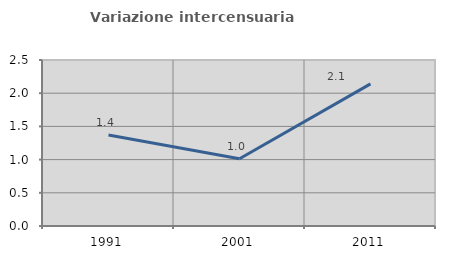
| Category | Variazione intercensuaria annua |
|---|---|
| 1991.0 | 1.371 |
| 2001.0 | 1.012 |
| 2011.0 | 2.14 |